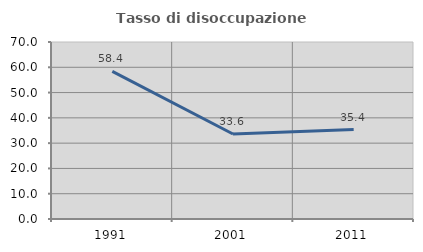
| Category | Tasso di disoccupazione giovanile  |
|---|---|
| 1991.0 | 58.369 |
| 2001.0 | 33.628 |
| 2011.0 | 35.385 |